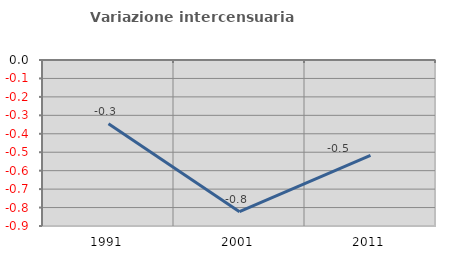
| Category | Variazione intercensuaria annua |
|---|---|
| 1991.0 | -0.346 |
| 2001.0 | -0.823 |
| 2011.0 | -0.517 |